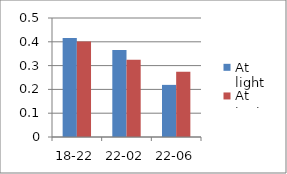
| Category | At light | At tent |
|---|---|---|
| 18-22 | 0.416 | 0.401 |
| 22-02 | 0.365 | 0.325 |
| 22-06 | 0.219 | 0.274 |